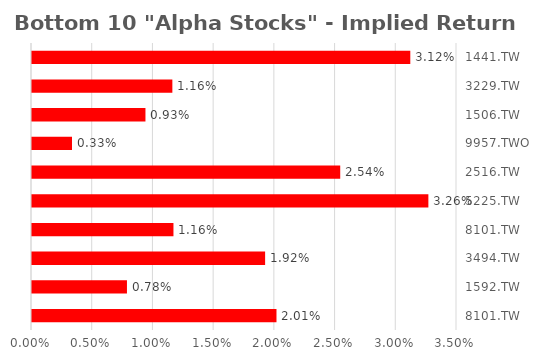
| Category | Series 0 |
|---|---|
| 8101.TW | 0.02 |
| 1592.TW | 0.008 |
| 3494.TW | 0.019 |
| 8101.TW | 0.012 |
| 5225.TW | 0.033 |
| 2516.TW | 0.025 |
| 9957.TWO | 0.003 |
| 1506.TW | 0.009 |
| 3229.TW | 0.012 |
| 1441.TW | 0.031 |